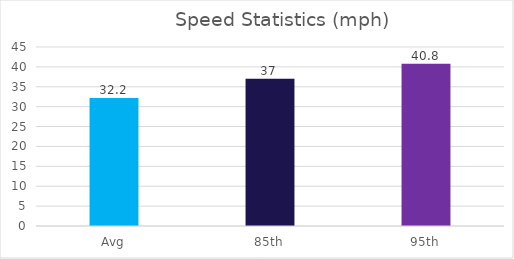
| Category | Series 0 |
|---|---|
| Avg | 32.2 |
| 85th | 37 |
| 95th | 40.8 |